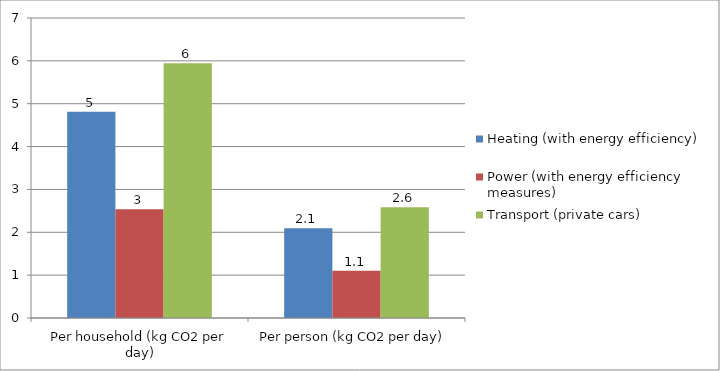
| Category | Heating (with energy efficiency) | Power (with energy efficiency measures) | Transport (private cars) |
|---|---|---|---|
| Per household (kg CO2 per day) | 4.812 | 2.538 | 5.943 |
| Per person (kg CO2 per day) | 2.092 | 1.104 | 2.584 |